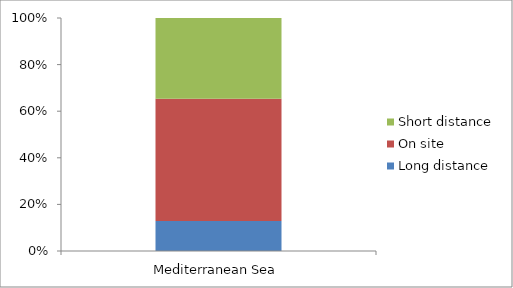
| Category | Long distance | On site | Short distance |
|---|---|---|---|
| Mediterranean Sea | 20841.25 | 85343 | 56301.25 |